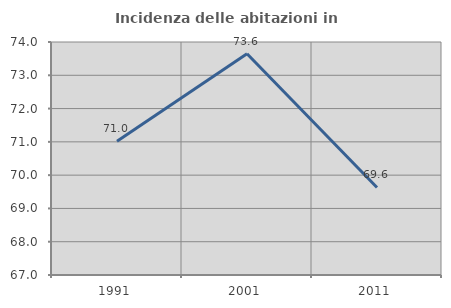
| Category | Incidenza delle abitazioni in proprietà  |
|---|---|
| 1991.0 | 71.017 |
| 2001.0 | 73.647 |
| 2011.0 | 69.63 |